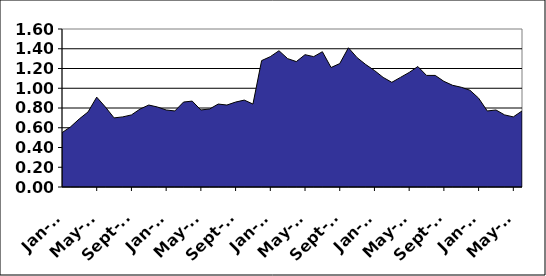
| Category | Series 0 |
|---|---|
| 2000-01-01 | 0.55 |
| 2000-02-01 | 0.61 |
| 2000-03-01 | 0.69 |
| 2000-04-01 | 0.76 |
| 2000-05-01 | 0.91 |
| 2000-06-01 | 0.81 |
| 2000-07-01 | 0.7 |
| 2000-08-01 | 0.71 |
| 2000-09-01 | 0.73 |
| 2000-10-01 | 0.79 |
| 2000-11-01 | 0.83 |
| 2000-12-01 | 0.81 |
| 2001-01-01 | 0.78 |
| 2001-02-01 | 0.77 |
| 2001-03-01 | 0.86 |
| 2001-04-01 | 0.87 |
| 2001-05-01 | 0.78 |
| 2001-06-01 | 0.79 |
| 2001-07-01 | 0.84 |
| 2001-08-01 | 0.83 |
| 2001-09-01 | 0.86 |
| 2001-10-01 | 0.88 |
| 2001-11-01 | 0.84 |
| 2001-12-01 | 1.28 |
| 2002-01-01 | 1.32 |
| 2002-02-01 | 1.38 |
| 2002-03-01 | 1.3 |
| 2002-04-01 | 1.27 |
| 2002-05-01 | 1.34 |
| 2002-06-01 | 1.32 |
| 2002-07-01 | 1.37 |
| 2002-08-01 | 1.21 |
| 2002-09-01 | 1.25 |
| 2002-10-01 | 1.41 |
| 2002-11-01 | 1.31 |
| 2002-12-01 | 1.24 |
| 2003-01-01 | 1.18 |
| 2003-02-01 | 1.11 |
| 2003-03-01 | 1.06 |
| 2003-04-01 | 1.11 |
| 2003-05-01 | 1.16 |
| 2003-06-01 | 1.22 |
| 2003-07-01 | 1.13 |
| 2003-08-01 | 1.13 |
| 2003-09-01 | 1.07 |
| 2003-10-01 | 1.03 |
| 2003-11-01 | 1.01 |
| 2003-12-01 | 0.98 |
| 2004-01-01 | 0.9 |
| 2004-02-01 | 0.77 |
| 2004-03-01 | 0.78 |
| 2004-04-01 | 0.73 |
| 2004-05-01 | 0.71 |
| 2004-06-01 | 0.77 |